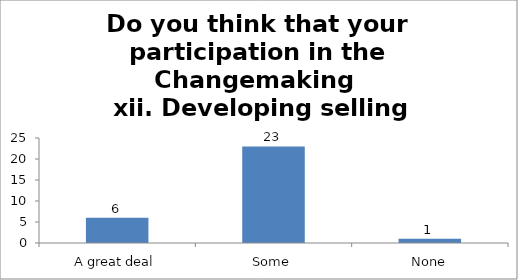
| Category | Do you think that your participation in the Changemaking 
 xii. Developing selling skills. |
|---|---|
| A great deal | 6 |
| Some | 23 |
| None | 1 |